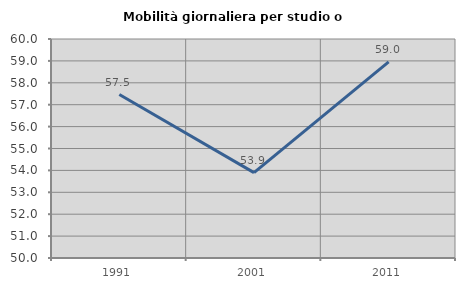
| Category | Mobilità giornaliera per studio o lavoro |
|---|---|
| 1991.0 | 57.463 |
| 2001.0 | 53.901 |
| 2011.0 | 58.957 |